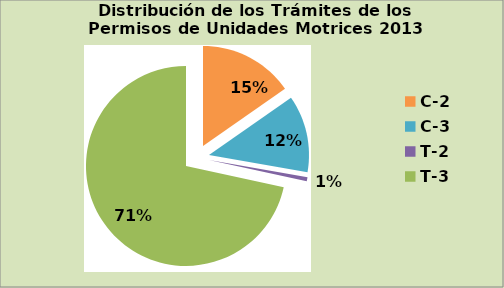
| Category | Series 0 |
|---|---|
| C-2 | 15.264 |
| C-3 | 12.416 |
| T-2 | 0.659 |
| T-3 | 71.429 |